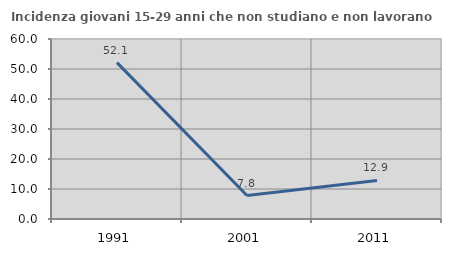
| Category | Incidenza giovani 15-29 anni che non studiano e non lavorano  |
|---|---|
| 1991.0 | 52.138 |
| 2001.0 | 7.812 |
| 2011.0 | 12.862 |